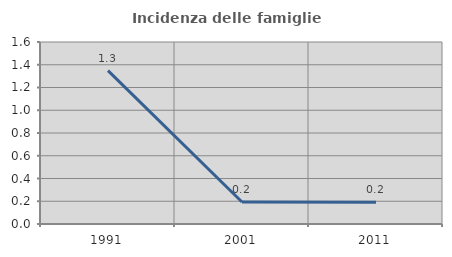
| Category | Incidenza delle famiglie numerose |
|---|---|
| 1991.0 | 1.349 |
| 2001.0 | 0.193 |
| 2011.0 | 0.192 |